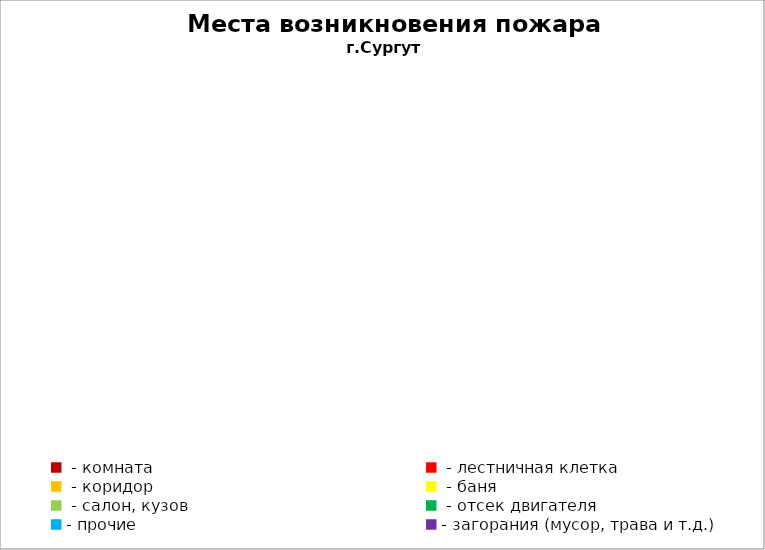
| Category | Места возникновения пожара |
|---|---|
|  - комната | 85 |
|  - лестничная клетка | 16 |
|  - коридор | 12 |
|  - баня | 50 |
|  - салон, кузов | 31 |
|  - отсек двигателя | 53 |
| - прочие | 123 |
| - загорания (мусор, трава и т.д.)  | 176 |